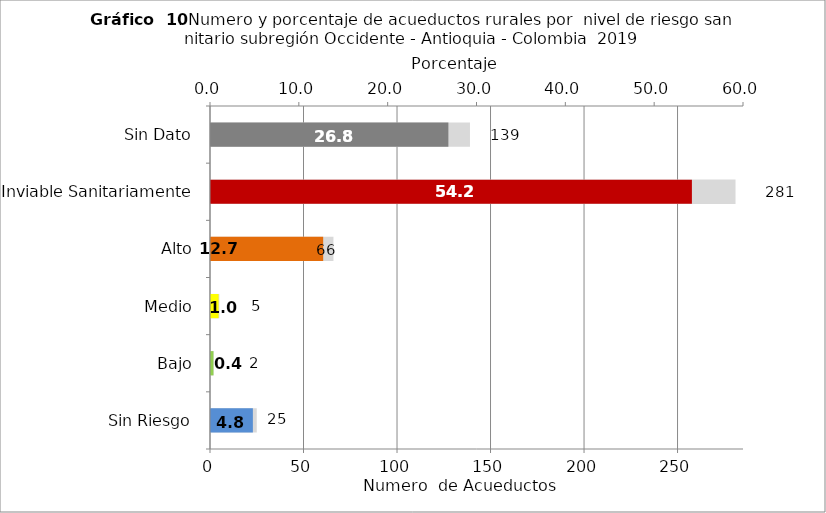
| Category | Número de Sistemas |
|---|---|
| Sin Riesgo | 25 |
| Bajo | 2 |
| Medio | 5 |
| Alto | 66 |
| Inviable Sanitariamente | 281 |
| Sin Dato | 139 |